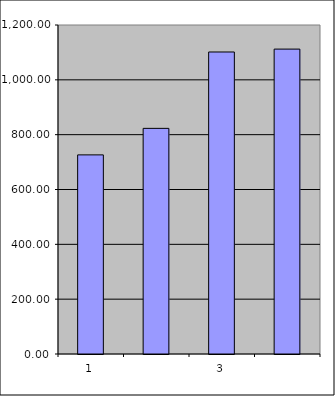
| Category | Series 0 |
|---|---|
| 0 | 726.25 |
| 1 | 822.995 |
| 2 | 1101.522 |
| 3 | 1112.117 |